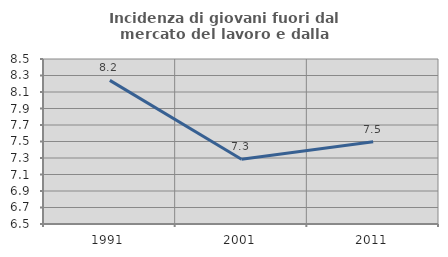
| Category | Incidenza di giovani fuori dal mercato del lavoro e dalla formazione  |
|---|---|
| 1991.0 | 8.241 |
| 2001.0 | 7.284 |
| 2011.0 | 7.497 |